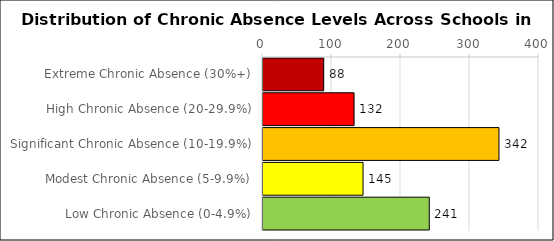
| Category | Number of Schools |
|---|---|
| Extreme Chronic Absence (30%+) | 88 |
| High Chronic Absence (20-29.9%) | 132 |
| Significant Chronic Absence (10-19.9%) | 342 |
| Modest Chronic Absence (5-9.9%) | 145 |
| Low Chronic Absence (0-4.9%) | 241 |